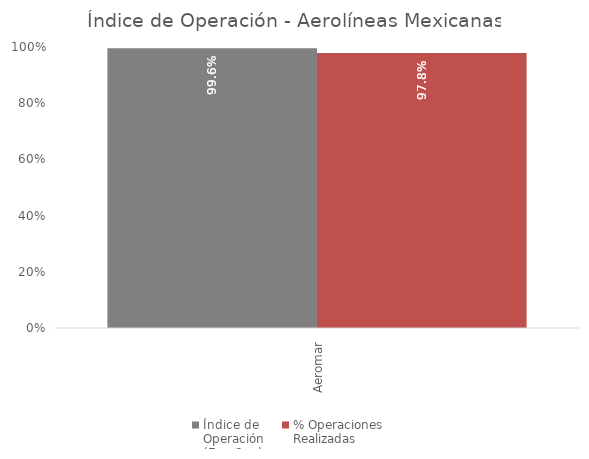
| Category | Índice de 
Operación
(Ene-Sep) | % Operaciones
Realizadas |
|---|---|---|
| Aeromar | 0.996 | 0.978 |